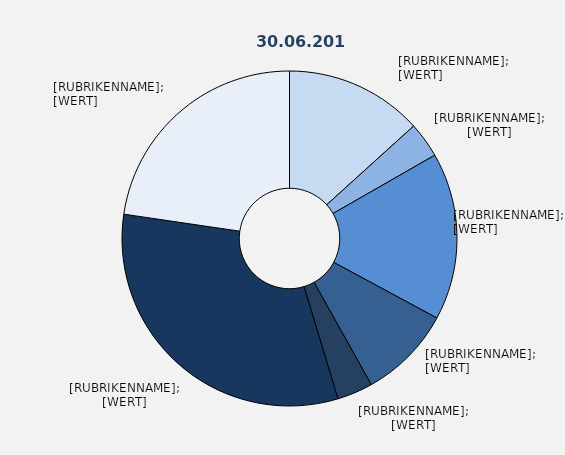
| Category | Series 1 |
|---|---|
| Produzierendes Gewerbe² ohne Baugewerbe | 13.283 |
| Baugewerbe | 3.43 |
| Handel | 16.161 |
| Verkehr und Lagerei | 9.006 |
| Gastgewerbe | 3.449 |
| Erbringung von Unternehmensdienstleistungen | 31.994 |
| Erbringung von öffentlichen und privaten Dienstleistungen | 22.677 |